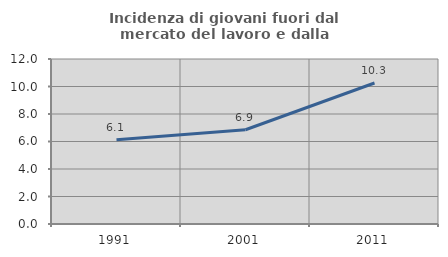
| Category | Incidenza di giovani fuori dal mercato del lavoro e dalla formazione  |
|---|---|
| 1991.0 | 6.121 |
| 2001.0 | 6.855 |
| 2011.0 | 10.256 |